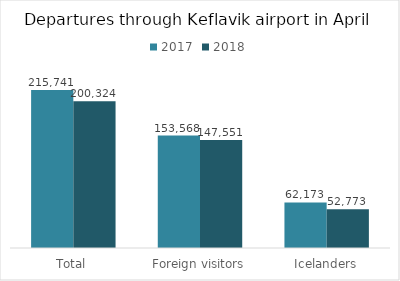
| Category | 2017 | 2018 |
|---|---|---|
| Total | 215741 | 200324 |
| Foreign visitors | 153568 | 147551 |
| Icelanders | 62173 | 52773 |